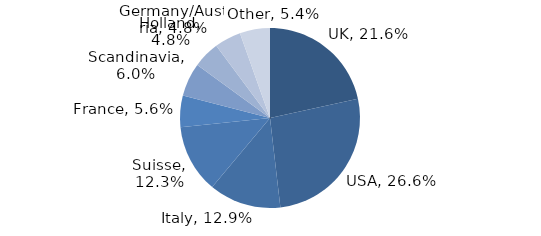
| Category | Investment Style |
|---|---|
| UK | 0.216 |
| USA | 0.266 |
| Italy | 0.129 |
| Suisse | 0.123 |
| France | 0.056 |
| Scandinavia | 0.06 |
| Holland | 0.048 |
| Germany/Austria | 0.048 |
| Other | 0.054 |